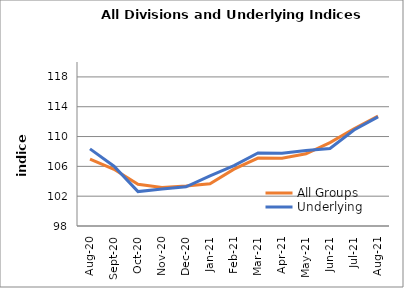
| Category | All Groups | Underlying |
|---|---|---|
| 2020-08-01 | 106.963 | 108.349 |
| 2020-09-01 | 105.614 | 106.027 |
| 2020-10-01 | 103.588 | 102.619 |
| 2020-11-01 | 103.171 | 102.969 |
| 2020-12-01 | 103.378 | 103.266 |
| 2021-01-01 | 103.671 | 104.733 |
| 2021-02-01 | 105.627 | 106.099 |
| 2021-03-01 | 107.11 | 107.788 |
| 2021-04-01 | 107.082 | 107.772 |
| 2021-05-01 | 107.693 | 108.128 |
| 2021-06-01 | 109.193 | 108.399 |
| 2021-07-01 | 111.039 | 110.883 |
| 2021-08-01 | 112.735 | 112.633 |